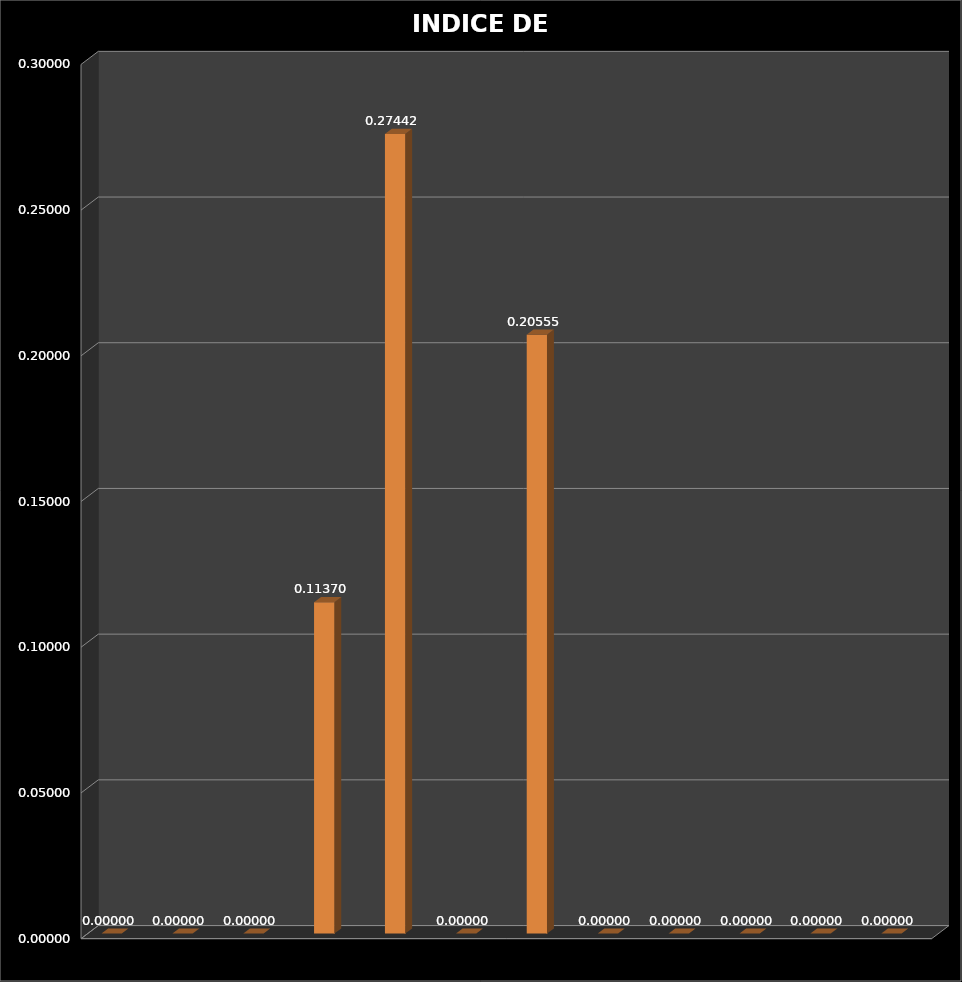
| Category | Series 0 | Series 1 |
|---|---|---|
| ENE | 0 |  |
| FEB | 0 |  |
| MAR | 0 |  |
| ABR | 0.114 |  |
| MAY | 0.274 |  |
| JUN | 0 |  |
| JUL | 0.206 |  |
| AGO | 0 |  |
| SEP | 0 |  |
| OCT | 0 |  |
| NOV | 0 |  |
| DIC | 0 |  |